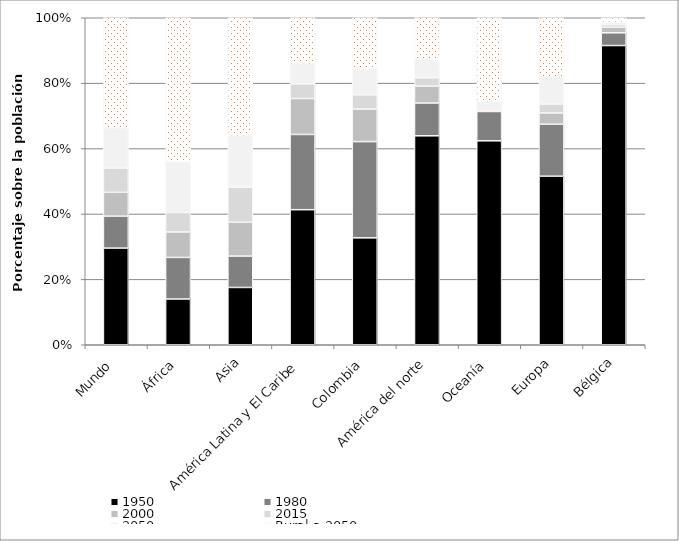
| Category | 1950 | 1980 | 2000 | 2015 | 2050 | Rural a 2050 |
|---|---|---|---|---|---|---|
| Mundo | 29.555 | 9.769 | 7.286 | 7.416 | 12.34 | 33.634 |
| África | 13.999 | 12.706 | 7.783 | 5.95 | 15.495 | 44.067 |
| Asia | 17.523 | 9.597 | 10.346 | 10.726 | 15.971 | 35.837 |
| América Latina y El Caribe | 41.303 | 23.01 | 10.985 | 4.499 | 6.393 | 13.81 |
| Colombia | 32.7 | 29.421 | 9.954 | 4.361 | 7.901 | 15.663 |
| América del norte | 63.903 | 10.027 | 5.173 | 2.54 | 5.778 | 12.58 |
| Oceanía | 62.375 | 8.956 | 0 | 0.262 | 2.743 | 25.664 |
| Europa | 51.538 | 15.91 | 3.438 | 2.732 | 8.337 | 18.045 |
| Bélgica | 91.5 | 3.9 | 1.7 | 0.8 | 0.7 | 1.4 |